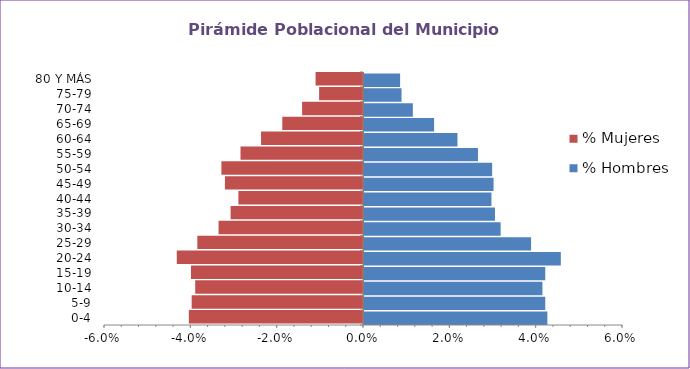
| Category | % Hombres | % Mujeres |
|---|---|---|
| 0-4 | 0.042 | -0.04 |
| 5-9 | 0.042 | -0.04 |
| 10-14 | 0.041 | -0.039 |
| 15-19 | 0.042 | -0.04 |
| 20-24 | 0.046 | -0.043 |
| 25-29 | 0.039 | -0.038 |
| 30-34 | 0.032 | -0.033 |
| 35-39 | 0.03 | -0.031 |
| 40-44 | 0.03 | -0.029 |
| 45-49 | 0.03 | -0.032 |
| 50-54 | 0.03 | -0.033 |
| 55-59 | 0.026 | -0.028 |
| 60-64 | 0.022 | -0.024 |
| 65-69 | 0.016 | -0.019 |
| 70-74 | 0.011 | -0.014 |
| 75-79 | 0.009 | -0.01 |
| 80 Y MÁS | 0.008 | -0.011 |